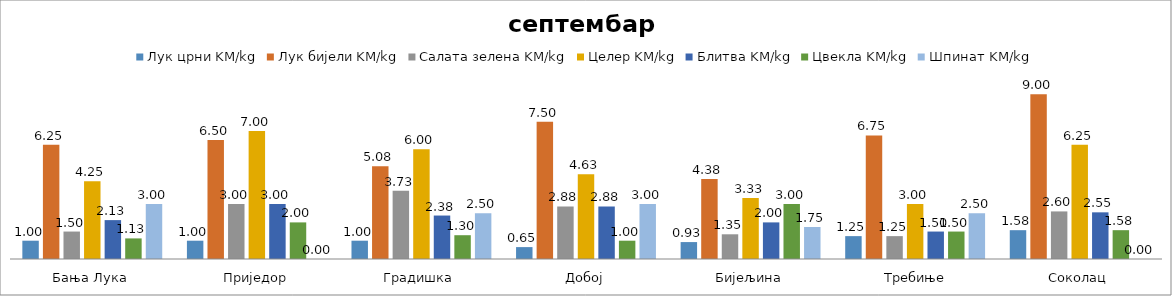
| Category | Лук црни KM/kg | Лук бијели KM/kg | Салата зелена KM/kg | Целер KM/kg | Блитва KM/kg | Цвекла KM/kg | Шпинат KM/kg |
|---|---|---|---|---|---|---|---|
| Бања Лука | 1 | 6.25 | 1.5 | 4.25 | 2.125 | 1.125 | 3 |
| Приједор | 1 | 6.5 | 3 | 7 | 3 | 2 | 0 |
| Градишка | 1 | 5.075 | 3.725 | 6 | 2.375 | 1.3 | 2.5 |
| Добој | 0.65 | 7.5 | 2.875 | 4.625 | 2.875 | 1 | 3 |
| Бијељина | 0.925 | 4.375 | 1.35 | 3.333 | 2 | 3 | 1.75 |
|  Требиње | 1.25 | 6.75 | 1.25 | 3 | 1.5 | 1.5 | 2.5 |
| Соколац | 1.575 | 9 | 2.6 | 6.25 | 2.55 | 1.575 | 0 |